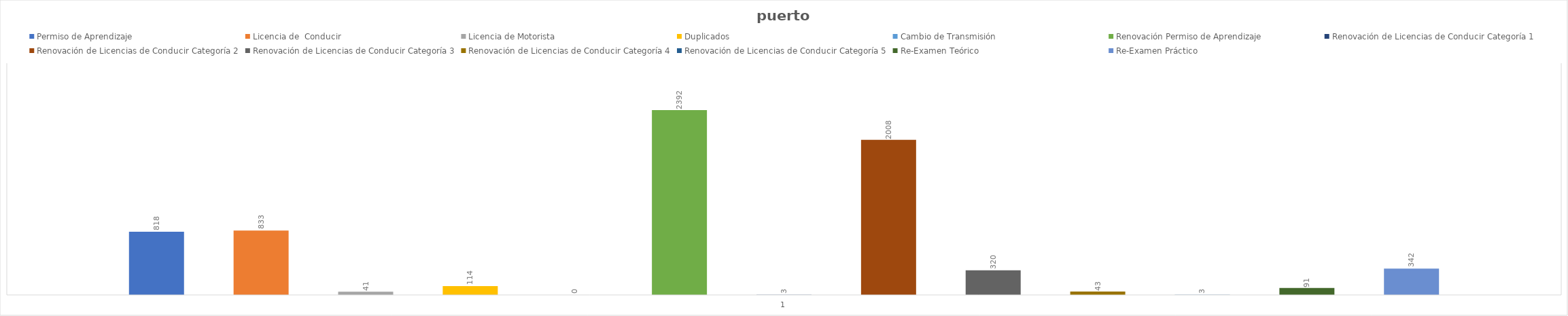
| Category | Permiso de Aprendizaje  | Licencia de  Conducir  | Licencia de Motorista | Duplicados  | Cambio de Transmisión  | Renovación Permiso de Aprendizaje | Renovación de Licencias de Conducir Categoría 1 | Renovación de Licencias de Conducir Categoría 2 | Renovación de Licencias de Conducir Categoría 3 | Renovación de Licencias de Conducir Categoría 4 | Renovación de Licencias de Conducir Categoría 5 | Re-Examen Teórico | Re-Examen Práctico |
|---|---|---|---|---|---|---|---|---|---|---|---|---|---|
| 0 | 818 | 833 | 41 | 114 | 0 | 2392 | 3 | 2008 | 320 | 43 | 3 | 91 | 342 |